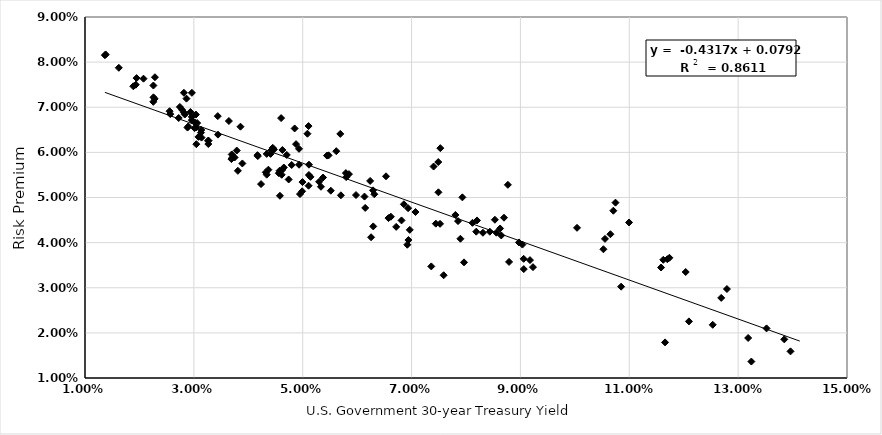
| Category | Series 0 |
|---|---|
| 0.11657096774193544 | 0.018 |
| 0.10524920634920633 | 0.039 |
| 0.1085 | 0.03 |
| 0.12096229508196724 | 0.023 |
| 0.1253327868852459 | 0.022 |
| 0.13242857142857142 | 0.014 |
| 0.14132343749999998 | 0.007 |
| 0.13847868852459014 | 0.019 |
| 0.13962131147540985 | 0.016 |
| 0.13521904761904768 | 0.021 |
| 0.12794375000000005 | 0.03 |
| 0.10746229508196721 | 0.049 |
| 0.10706825396825397 | 0.047 |
| 0.10653174603174603 | 0.042 |
| 0.11624531249999998 | 0.036 |
| 0.11737 | 0.037 |
| 0.1203629032258065 | 0.033 |
| 0.13183968253968248 | 0.019 |
| 0.12689047619047616 | 0.028 |
| 0.11698852459016393 | 0.036 |
| 0.11584000000000001 | 0.034 |
| 0.10995873015873014 | 0.044 |
| 0.10553015873015874 | 0.041 |
| 0.10039838709677419 | 0.043 |
| 0.08769333333333332 | 0.053 |
| 0.07490625000000001 | 0.058 |
| 0.0740421875 | 0.057 |
| 0.07528064516129031 | 0.061 |
| 0.07493606557377049 | 0.051 |
| 0.08530634920634919 | 0.045 |
| 0.09059218749999998 | 0.036 |
| 0.09230153846153845 | 0.035 |
| 0.08626612903225808 | 0.043 |
| 0.09061428571428574 | 0.034 |
| 0.09175468750000004 | 0.036 |
| 0.08973015873015877 | 0.04 |
| 0.09036129032258064 | 0.04 |
| 0.0869796875 | 0.046 |
| 0.08118730158730159 | 0.044 |
| 0.079334375 | 0.05 |
| 0.0843761904761905 | 0.042 |
| 0.08647936507936509 | 0.042 |
| 0.087915873015873 | 0.036 |
| 0.08557846153846152 | 0.042 |
| 0.08202419354838708 | 0.045 |
| 0.08311406250000002 | 0.042 |
| 0.08188593750000002 | 0.042 |
| 0.07853384615384616 | 0.045 |
| 0.07805079365079366 | 0.046 |
| 0.07897619047619048 | 0.041 |
| 0.07445625 | 0.044 |
| 0.07523593749999999 | 0.044 |
| 0.07071612903225807 | 0.047 |
| 0.06858412698412701 | 0.048 |
| 0.06315468750000001 | 0.051 |
| 0.06135156250000001 | 0.05 |
| 0.06575873015873016 | 0.045 |
| 0.0736225806451613 | 0.035 |
| 0.07589375000000002 | 0.033 |
| 0.07963333333333333 | 0.036 |
| 0.06942222222222219 | 0.041 |
| 0.06717301587301586 | 0.043 |
| 0.062390476190476205 | 0.054 |
| 0.06291692307692306 | 0.052 |
| 0.06921538461538461 | 0.04 |
| 0.06967272727272728 | 0.043 |
| 0.0662 | 0.046 |
| 0.068153125 | 0.045 |
| 0.06936923076923075 | 0.048 |
| 0.06530454545454545 | 0.055 |
| 0.061478125000000015 | 0.048 |
| 0.05849076923076921 | 0.055 |
| 0.05476212121212124 | 0.059 |
| 0.051071212121212115 | 0.066 |
| 0.053734374999999994 | 0.054 |
| 0.05798769230769229 | 0.055 |
| 0.06255909090909091 | 0.041 |
| 0.0629584615384615 | 0.044 |
| 0.0597876923076923 | 0.051 |
| 0.05793230769230769 | 0.055 |
| 0.056907692307692305 | 0.064 |
| 0.054464615384615396 | 0.059 |
| 0.05701692307692307 | 0.05 |
| 0.05301969696969697 | 0.053 |
| 0.0551578125 | 0.052 |
| 0.05616461538461539 | 0.06 |
| 0.050868181818181826 | 0.064 |
| 0.04932272727272727 | 0.061 |
| 0.04851875 | 0.065 |
| 0.04603230769230768 | 0.068 |
| 0.05113939393939395 | 0.055 |
| 0.05114696969696969 | 0.057 |
| 0.04877692307692307 | 0.062 |
| 0.053353846153846154 | 0.052 |
| 0.05107424242424244 | 0.053 |
| 0.049322727272727296 | 0.057 |
| 0.0470703125 | 0.059 |
| 0.044709230769230765 | 0.061 |
| 0.04422878787878787 | 0.06 |
| 0.046523076923076924 | 0.057 |
| 0.04627076923076921 | 0.061 |
| 0.0514276923076923 | 0.055 |
| 0.04995538461538463 | 0.053 |
| 0.04742307692307691 | 0.054 |
| 0.047975384615384635 | 0.057 |
| 0.049892307692307715 | 0.051 |
| 0.04949999999999998 | 0.051 |
| 0.046140000000000014 | 0.055 |
| 0.04409538461538462 | 0.06 |
| 0.045739999999999996 | 0.056 |
| 0.044501515151515146 | 0.061 |
| 0.036437500000000005 | 0.067 |
| 0.034393749999999994 | 0.068 |
| 0.041692307692307695 | 0.059 |
| 0.04321666666666666 | 0.056 |
| 0.0433921875 | 0.06 |
| 0.046243749999999986 | 0.056 |
| 0.043692307692307676 | 0.056 |
| 0.038563636363636355 | 0.066 |
| 0.04174923076923077 | 0.059 |
| 0.045609374999999994 | 0.055 |
| 0.04338769230769231 | 0.055 |
| 0.03696060606060605 | 0.06 |
| 0.030376190476190473 | 0.068 |
| 0.03136153846153846 | 0.065 |
| 0.029363076923076922 | 0.069 |
| 0.02742923076923078 | 0.07 |
| 0.028639062499999993 | 0.072 |
| 0.03130312500000001 | 0.064 |
| 0.031412307692307684 | 0.063 |
| 0.037107575757575756 | 0.059 |
| 0.03788281250000001 | 0.06 |
| 0.03690312500000001 | 0.059 |
| 0.03443076923076924 | 0.064 |
| 0.03265757575757575 | 0.062 |
| 0.029637499999999997 | 0.073 |
| 0.025540625000000004 | 0.069 |
| 0.028836923076923083 | 0.065 |
| 0.02962424242424244 | 0.068 |
| 0.029630303030303028 | 0.067 |
| 0.02721846153846154 | 0.068 |
| 0.025672307692307696 | 0.068 |
| 0.022793939393939398 | 0.072 |
| 0.028333846153846154 | 0.068 |
| 0.03045230769230771 | 0.066 |
| 0.028972307692307693 | 0.066 |
| 0.028173846153846157 | 0.073 |
| 0.02817384615384615 | 0.069 |
| 0.030235384615384615 | 0.067 |
| 0.030853846153846162 | 0.063 |
| 0.030607692307692315 | 0.067 |
| 0.0326939393939394 | 0.063 |
| 0.0301296875 | 0.065 |
| 0.027836923076923075 | 0.069 |
| 0.022849999999999995 | 0.077 |
| 0.022566666666666676 | 0.075 |
| 0.01887846153846154 | 0.075 |
| 0.013801538461538454 | 0.082 |
| 0.013654545454545457 | 0.082 |
| 0.016210606060606054 | 0.079 |
| 0.020748437499999998 | 0.076 |
| 0.022579999999999996 | 0.072 |
| 0.019333333333333327 | 0.075 |
| 0.019479687499999995 | 0.076 |
| 0.022546031746031748 | 0.071 |
| 0.0304553846153846 | 0.062 |
| 0.03260757575757576 | 0.063 |
| 0.0389125 | 0.058 |
| 0.03749538461538462 | 0.059 |
| 0.03808461538461537 | 0.056 |
| 0.04234461538461539 | 0.053 |
| 0.0458171875 | 0.05 |